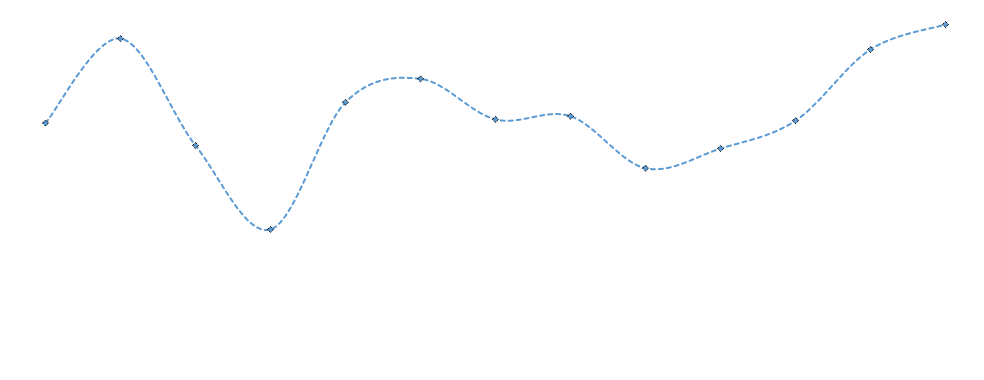
| Category | Series 0 |
|---|---|
| 0 | 24647.789 |
| 1 | 25575.859 |
| 2 | 24401.229 |
| 3 | 23479.395 |
| 4 | 24875.735 |
| 5 | 25133.337 |
| 6 | 24687.831 |
| 7 | 24722.572 |
| 8 | 24151.364 |
| 9 | 24367.337 |
| 10 | 24673.711 |
| 11 | 25456.512 |
| 12 | 25730.753 |